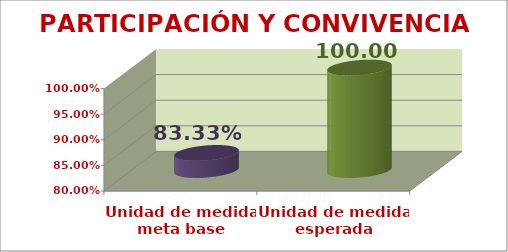
| Category | PARTICIPACIÓN Y CONVIVENCIA |
|---|---|
| Unidad de medida meta base | 0.833 |
| Unidad de medida esperada | 1 |